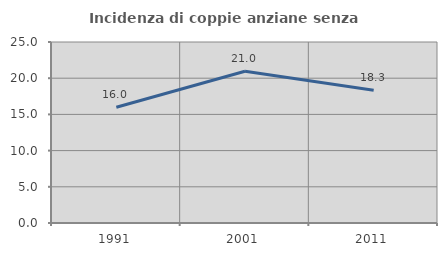
| Category | Incidenza di coppie anziane senza figli  |
|---|---|
| 1991.0 | 15.994 |
| 2001.0 | 20.951 |
| 2011.0 | 18.345 |